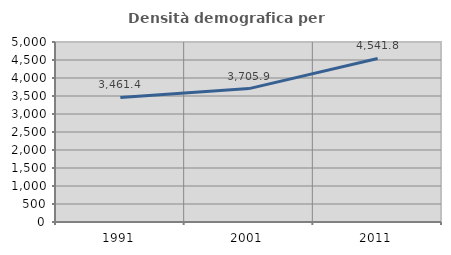
| Category | Densità demografica |
|---|---|
| 1991.0 | 3461.418 |
| 2001.0 | 3705.935 |
| 2011.0 | 4541.787 |